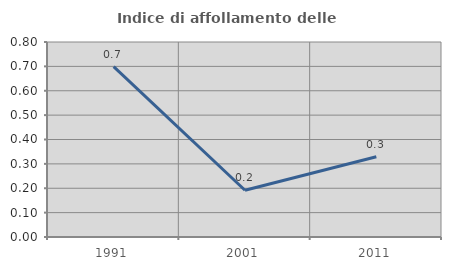
| Category | Indice di affollamento delle abitazioni  |
|---|---|
| 1991.0 | 0.699 |
| 2001.0 | 0.192 |
| 2011.0 | 0.329 |